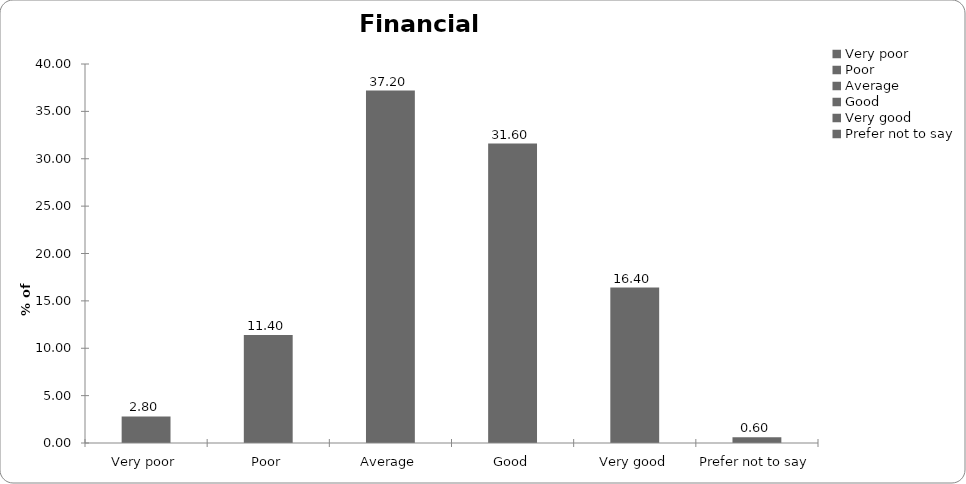
| Category | Series 0 |
|---|---|
| Very poor | 2.8 |
| Poor | 11.4 |
| Average | 37.2 |
| Good | 31.6 |
| Very good | 16.4 |
| Prefer not to say | 0.6 |